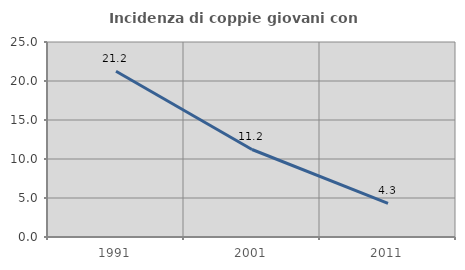
| Category | Incidenza di coppie giovani con figli |
|---|---|
| 1991.0 | 21.241 |
| 2001.0 | 11.218 |
| 2011.0 | 4.308 |